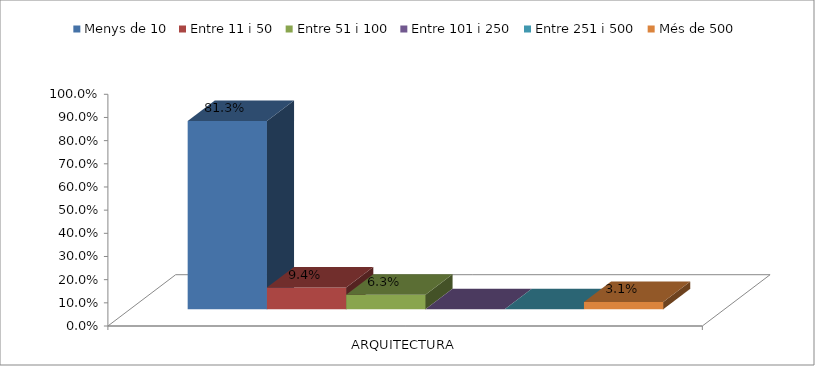
| Category | Menys de 10 | Entre 11 i 50 | Entre 51 i 100 | Entre 101 i 250 | Entre 251 i 500 | Més de 500 |
|---|---|---|---|---|---|---|
| ARQUITECTURA | 0.812 | 0.094 | 0.062 | 0 | 0 | 0.031 |